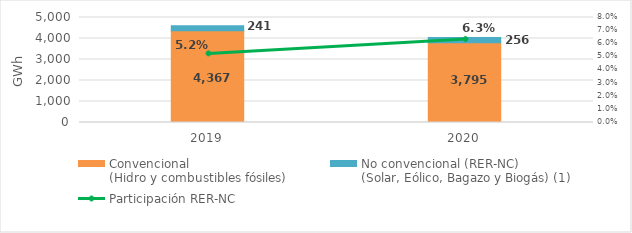
| Category | Convencional
(Hidro y combustibles fósiles) | No convencional (RER-NC)
(Solar, Eólico, Bagazo y Biogás) (1) |
|---|---|---|
| 2019.0 | 4366.845 | 240.788 |
| 2020.0 | 3795.062 | 255.912 |